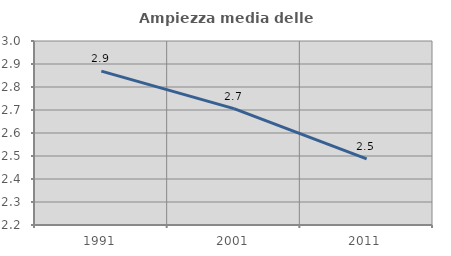
| Category | Ampiezza media delle famiglie |
|---|---|
| 1991.0 | 2.869 |
| 2001.0 | 2.706 |
| 2011.0 | 2.487 |